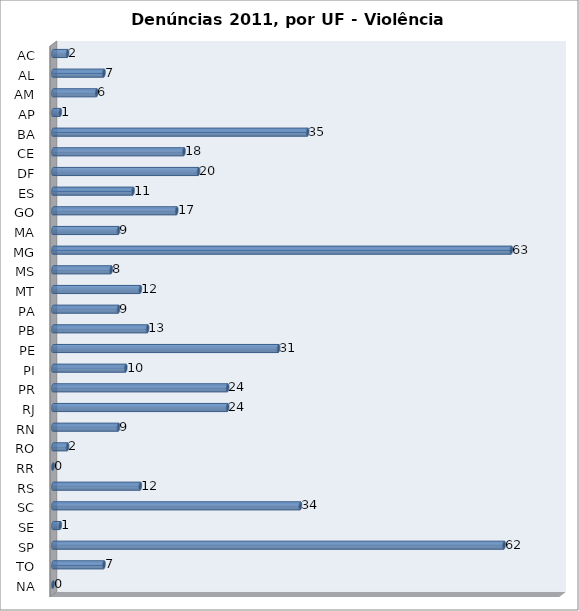
| Category | Series 0 |
|---|---|
| AC | 2 |
| AL | 7 |
| AM | 6 |
| AP | 1 |
| BA | 35 |
| CE | 18 |
| DF | 20 |
| ES | 11 |
| GO | 17 |
| MA | 9 |
| MG | 63 |
| MS | 8 |
| MT | 12 |
| PA | 9 |
| PB | 13 |
| PE | 31 |
| PI | 10 |
| PR | 24 |
| RJ | 24 |
| RN | 9 |
| RO | 2 |
| RR | 0 |
| RS | 12 |
| SC | 34 |
| SE | 1 |
| SP | 62 |
| TO | 7 |
| NA | 0 |